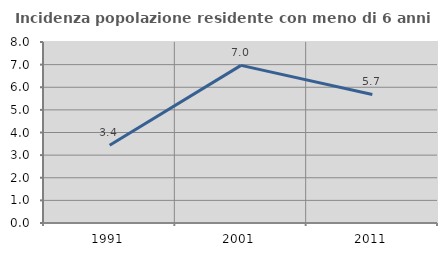
| Category | Incidenza popolazione residente con meno di 6 anni |
|---|---|
| 1991.0 | 3.433 |
| 2001.0 | 6.967 |
| 2011.0 | 5.682 |